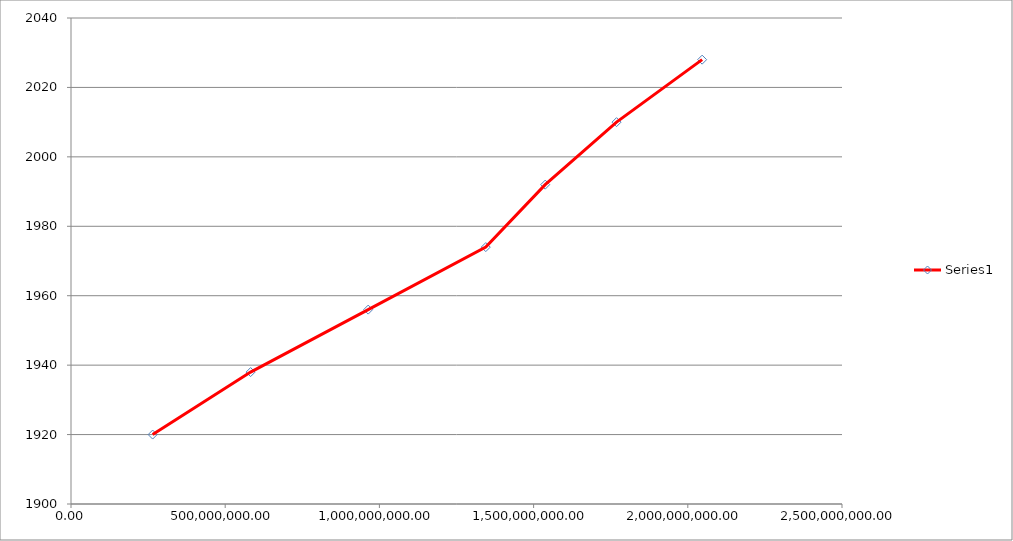
| Category | Series 0 |
|---|---|
| 264746000.0 | 1920 |
| 582441200.0 | 1938 |
| 963675440.0 | 1956 |
| 1344909680.0 | 1974 |
| 1537644768.0 | 1992 |
| 1768926873.6 | 2010 |
| 2046465400.32 | 2028 |